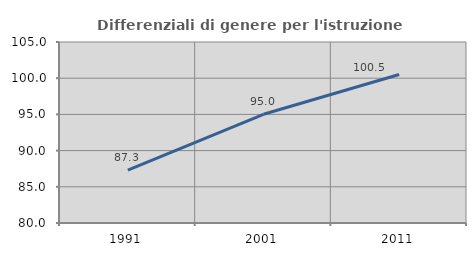
| Category | Differenziali di genere per l'istruzione superiore |
|---|---|
| 1991.0 | 87.3 |
| 2001.0 | 95.014 |
| 2011.0 | 100.517 |